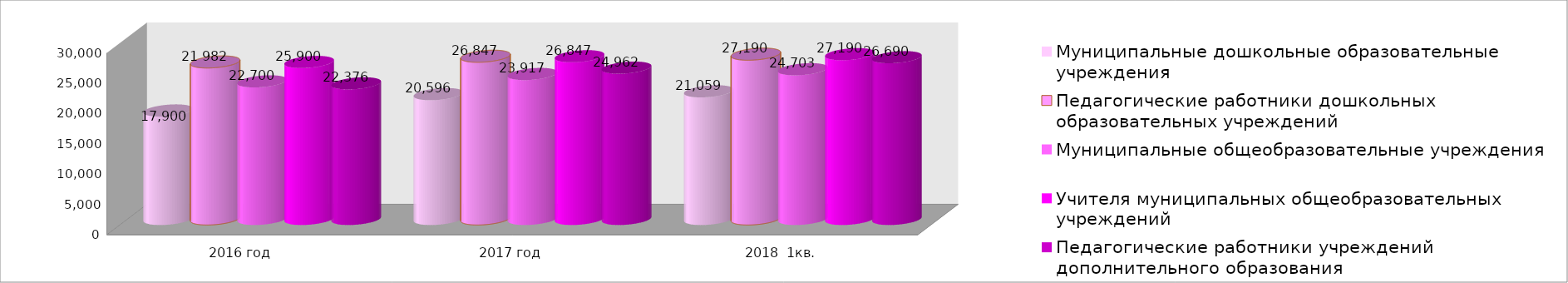
| Category | Муниципальные дошкольные образовательные учреждения | Педагогические работники дошкольных образовательных учреждений | Муниципальные общеобразовательные учреждения | Учителя муниципальных общеобразовательных учреждений | Педагогические работники учреждений дополнительного образования |
|---|---|---|---|---|---|
| 2016 год | 17900 | 25900 | 22700 | 25900 | 22376 |
| 2017 год | 20596 | 26847 | 23917 | 26847 | 24962 |
| 2018  1кв. | 21059 | 27190 | 24703 | 27190 | 26690 |